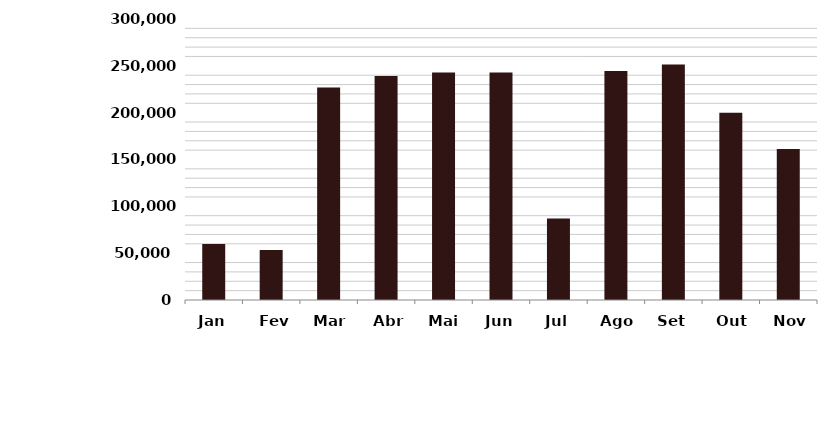
| Category | Series 0 |
|---|---|
| Jan | 59675 |
| Fev | 53418 |
| Mar | 226949 |
| Abr | 239059 |
| Mai | 242874 |
| Jun | 242978 |
| Jul | 87026 |
| Ago | 244501 |
| Set | 251543 |
| Out | 199851 |
| Nov | 161086 |